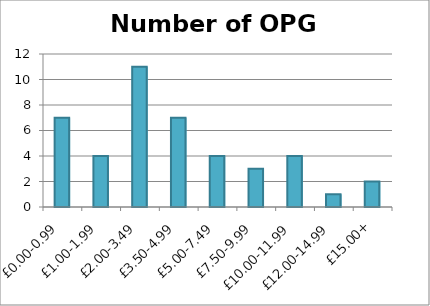
| Category | OPG |
|---|---|
| £0.00-0.99 | 7 |
| £1.00-1.99 | 4 |
| £2.00-3.49 | 11 |
| £3.50-4.99 | 7 |
| £5.00-7.49 | 4 |
| £7.50-9.99 | 3 |
| £10.00-11.99 | 4 |
| £12.00-14.99 | 1 |
| £15.00+ | 2 |